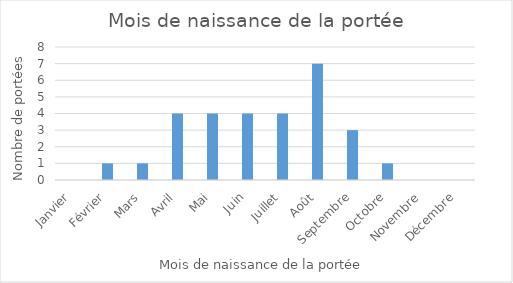
| Category | Series 0 |
|---|---|
| Janvier | 0 |
| Février | 1 |
| Mars | 1 |
| Avril | 4 |
| Mai | 4 |
| Juin | 4 |
| Juillet | 4 |
| Août | 7 |
| Septembre | 3 |
| Octobre | 1 |
| Novembre | 0 |
| Décembre | 0 |